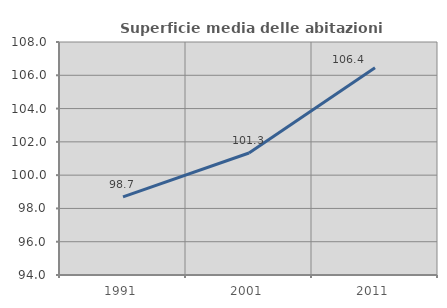
| Category | Superficie media delle abitazioni occupate |
|---|---|
| 1991.0 | 98.695 |
| 2001.0 | 101.332 |
| 2011.0 | 106.448 |